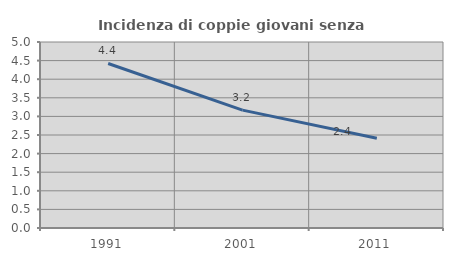
| Category | Incidenza di coppie giovani senza figli |
|---|---|
| 1991.0 | 4.422 |
| 2001.0 | 3.169 |
| 2011.0 | 2.415 |